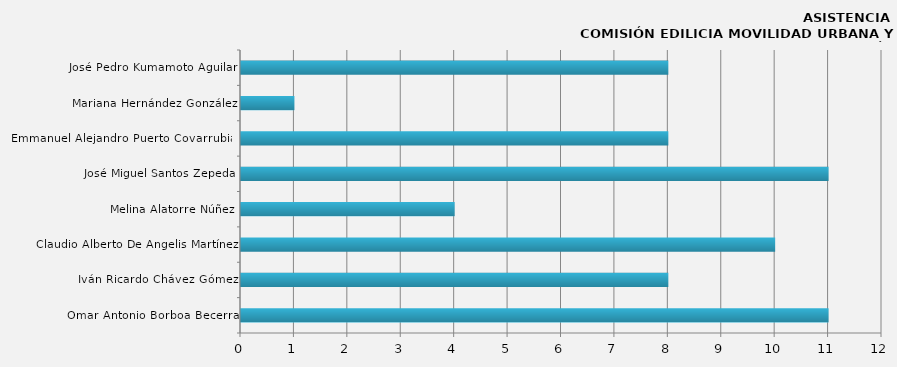
| Category | Series 0 |
|---|---|
| Omar Antonio Borboa Becerra | 11 |
| Iván Ricardo Chávez Gómez | 8 |
| Claudio Alberto De Angelis Martínez | 10 |
| Melina Alatorre Núñez | 4 |
| José Miguel Santos Zepeda | 11 |
| Emmanuel Alejandro Puerto Covarrubias | 8 |
| Mariana Hernández González | 1 |
| José Pedro Kumamoto Aguilar | 8 |